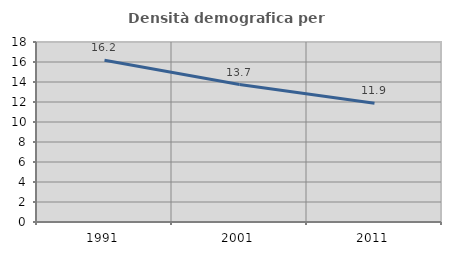
| Category | Densità demografica |
|---|---|
| 1991.0 | 16.169 |
| 2001.0 | 13.745 |
| 2011.0 | 11.88 |